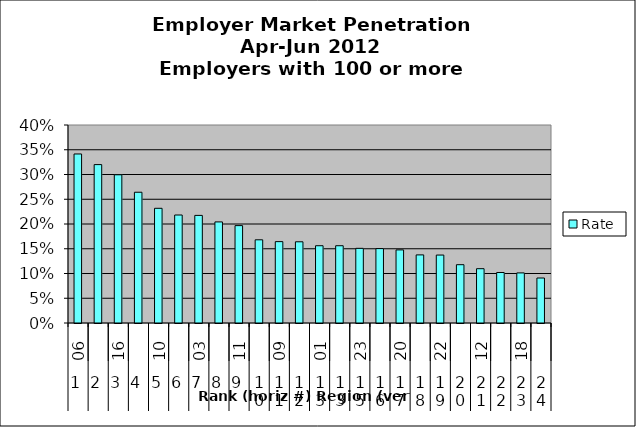
| Category | Rate |
|---|---|
| 0 | 0.341 |
| 1 | 0.32 |
| 2 | 0.299 |
| 3 | 0.264 |
| 4 | 0.232 |
| 5 | 0.218 |
| 6 | 0.217 |
| 7 | 0.204 |
| 8 | 0.197 |
| 9 | 0.168 |
| 10 | 0.164 |
| 11 | 0.164 |
| 12 | 0.156 |
| 13 | 0.156 |
| 14 | 0.151 |
| 15 | 0.15 |
| 16 | 0.148 |
| 17 | 0.138 |
| 18 | 0.137 |
| 19 | 0.118 |
| 20 | 0.11 |
| 21 | 0.102 |
| 22 | 0.101 |
| 23 | 0.091 |